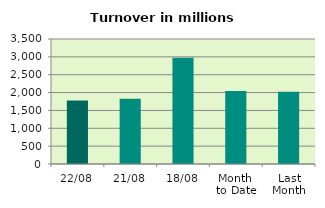
| Category | Series 0 |
|---|---|
| 22/08 | 1774.662 |
| 21/08 | 1828.757 |
| 18/08 | 2977.267 |
| Month 
to Date | 2040.625 |
| Last
Month | 2019.592 |